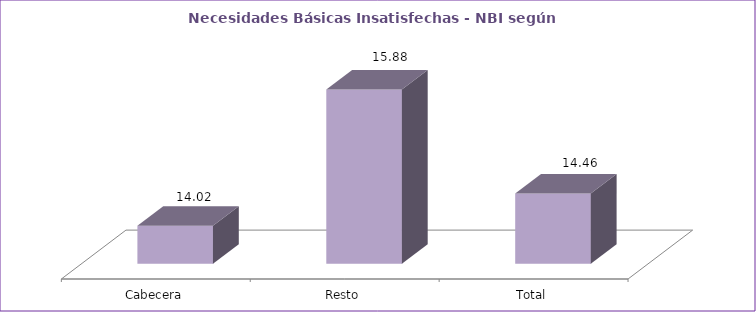
| Category | Series 0 |
|---|---|
| Cabecera | 14.02 |
| Resto | 15.88 |
| Total | 14.46 |